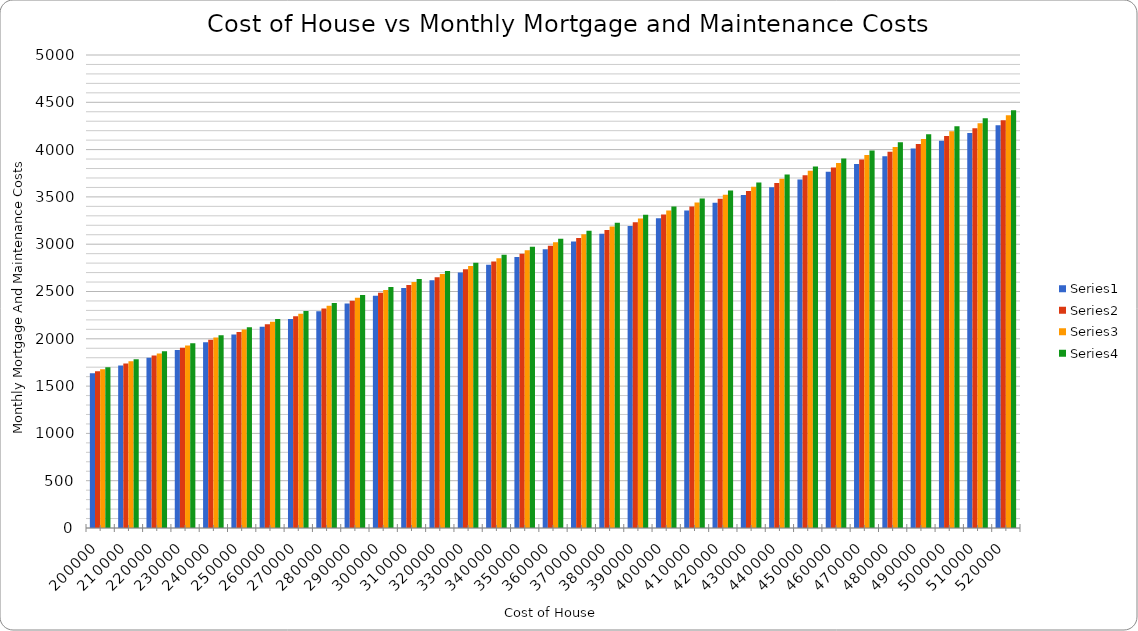
| Category | Series 0 | Series 1 | Series 2 | Series 3 |
|---|---|---|---|---|
| 200000.0 | 1636.98 | 1657.32 | 1677.867 | 1698.6 |
| 210000.0 | 1718.829 | 1740.186 | 1761.76 | 1783.53 |
| 220000.0 | 1800.678 | 1823.052 | 1845.653 | 1868.46 |
| 230000.0 | 1882.527 | 1905.918 | 1929.547 | 1953.39 |
| 240000.0 | 1964.376 | 1988.784 | 2013.44 | 2038.32 |
| 250000.0 | 2046.225 | 2071.65 | 2097.333 | 2123.25 |
| 260000.0 | 2128.074 | 2154.516 | 2181.227 | 2208.18 |
| 270000.0 | 2209.923 | 2237.382 | 2265.12 | 2293.11 |
| 280000.0 | 2291.772 | 2320.248 | 2349.013 | 2378.04 |
| 290000.0 | 2373.621 | 2403.114 | 2432.907 | 2462.97 |
| 300000.0 | 2455.47 | 2485.98 | 2516.8 | 2547.9 |
| 310000.0 | 2537.319 | 2568.846 | 2600.693 | 2632.83 |
| 320000.0 | 2619.168 | 2651.712 | 2684.587 | 2717.76 |
| 330000.0 | 2701.017 | 2734.578 | 2768.48 | 2802.69 |
| 340000.0 | 2782.866 | 2817.444 | 2852.373 | 2887.62 |
| 350000.0 | 2864.715 | 2900.31 | 2936.267 | 2972.55 |
| 360000.0 | 2946.564 | 2983.176 | 3020.16 | 3057.48 |
| 370000.0 | 3028.413 | 3066.042 | 3104.053 | 3142.41 |
| 380000.0 | 3110.262 | 3148.908 | 3187.947 | 3227.34 |
| 390000.0 | 3192.111 | 3231.774 | 3271.84 | 3312.27 |
| 400000.0 | 3273.96 | 3314.64 | 3355.733 | 3397.2 |
| 410000.0 | 3355.809 | 3397.506 | 3439.627 | 3482.13 |
| 420000.0 | 3437.658 | 3480.372 | 3523.52 | 3567.06 |
| 430000.0 | 3519.507 | 3563.238 | 3607.413 | 3651.99 |
| 440000.0 | 3601.356 | 3646.104 | 3691.307 | 3736.92 |
| 450000.0 | 3683.205 | 3728.97 | 3775.2 | 3821.85 |
| 460000.0 | 3765.054 | 3811.836 | 3859.093 | 3906.78 |
| 470000.0 | 3846.903 | 3894.702 | 3942.987 | 3991.71 |
| 480000.0 | 3928.752 | 3977.568 | 4026.88 | 4076.64 |
| 490000.0 | 4010.601 | 4060.434 | 4110.773 | 4161.57 |
| 500000.0 | 4092.45 | 4143.3 | 4194.667 | 4246.5 |
| 510000.0 | 4174.299 | 4226.166 | 4278.56 | 4331.43 |
| 520000.0 | 4256.148 | 4309.032 | 4362.453 | 4416.36 |